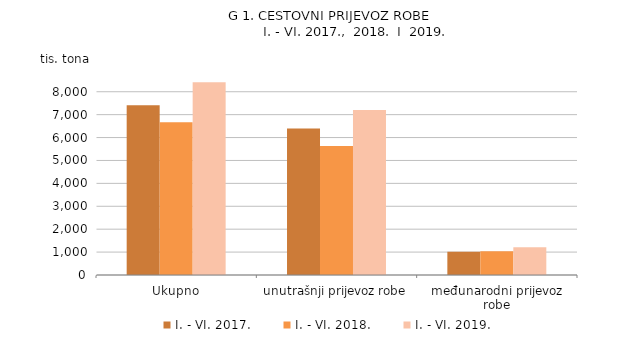
| Category | I. - VI. 2017. | I. - VI. 2018. | I. - VI. 2019. |
|---|---|---|---|
| Ukupno | 7409 | 6671 | 8415 |
| unutrašnji prijevoz robe | 6398 | 5634 | 7204 |
| međunarodni prijevoz robe | 1011 | 1037 | 1211 |